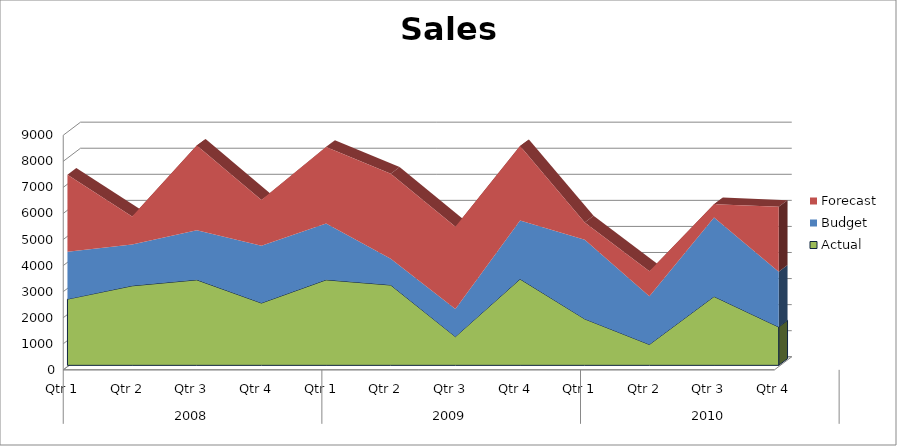
| Category | Actual | Budget | Forecast |
|---|---|---|---|
| 0 | 2590 | 1820 | 2950 |
| 1 | 3100 | 1590 | 1070 |
| 2 | 3330 | 1900 | 3250 |
| 3 | 2440 | 2200 | 1750 |
| 4 | 3330 | 2160 | 2940 |
| 5 | 3130 | 1010 | 3260 |
| 6 | 1150 | 1060 | 3160 |
| 7 | 3360 | 2250 | 2850 |
| 8 | 1830 | 3040 | 660 |
| 9 | 850 | 1850 | 960 |
| 10 | 2690 | 3030 | 510 |
| 11 | 1520 | 2120 | 2490 |